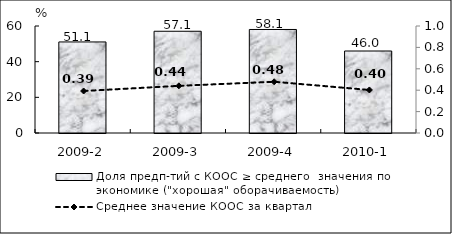
| Category | Доля предп-тий с КООС ≥ среднего  значения по экономике ("хорошая" оборачиваемость) |
|---|---|
| 2009-2 | 51.06 |
| 2009-3 | 57.05 |
| 2009-4 | 58.05 |
| 2010-1 | 45.98 |